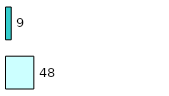
| Category | Series 0 | Series 1 |
|---|---|---|
| 0 | 48 | 9 |